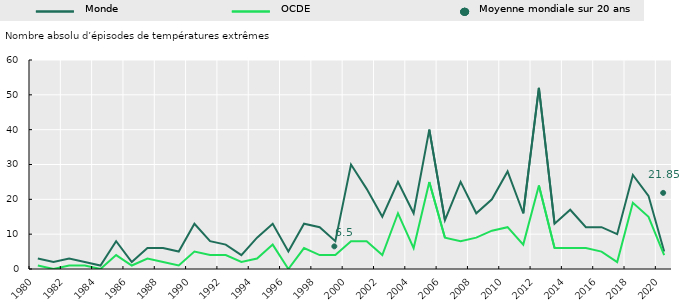
| Category | World | OECD |
|---|---|---|
| 1980 | 3 | 1 |
| 1981 | 2 | 0 |
| 1982 | 3 | 1 |
| 1983 | 2 | 1 |
| 1984 | 1 | 0 |
| 1985 | 8 | 4 |
| 1986 | 2 | 1 |
| 1987 | 6 | 3 |
| 1988 | 6 | 2 |
| 1989 | 5 | 1 |
| 1990 | 13 | 5 |
| 1991 | 8 | 4 |
| 1992 | 7 | 4 |
| 1993 | 4 | 2 |
| 1994 | 9 | 3 |
| 1995 | 13 | 7 |
| 1996 | 5 | 0 |
| 1997 | 13 | 6 |
| 1998 | 12 | 4 |
| 1999 | 8 | 4 |
| 2000 | 30 | 8 |
| 2001 | 23 | 8 |
| 2002 | 15 | 4 |
| 2003 | 25 | 16 |
| 2004 | 16 | 6 |
| 2005 | 40 | 25 |
| 2006 | 14 | 9 |
| 2007 | 25 | 8 |
| 2008 | 16 | 9 |
| 2009 | 20 | 11 |
| 2010 | 28 | 12 |
| 2011 | 16 | 7 |
| 2012 | 52 | 24 |
| 2013 | 13 | 6 |
| 2014 | 17 | 6 |
| 2015 | 12 | 6 |
| 2016 | 12 | 5 |
| 2017 | 10 | 2 |
| 2018 | 27 | 19 |
| 2019 | 21 | 15 |
| 2020 | 5 | 4 |